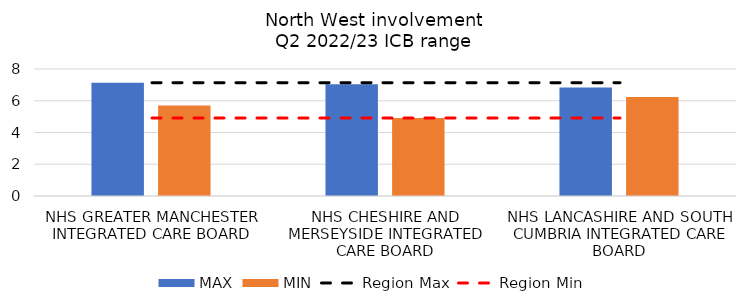
| Category | MAX | MIN |
|---|---|---|
| NHS GREATER MANCHESTER INTEGRATED CARE BOARD | 7.135 | 5.699 |
| NHS CHESHIRE AND MERSEYSIDE INTEGRATED CARE BOARD | 7.034 | 4.911 |
| NHS LANCASHIRE AND SOUTH CUMBRIA INTEGRATED CARE BOARD | 6.83 | 6.235 |